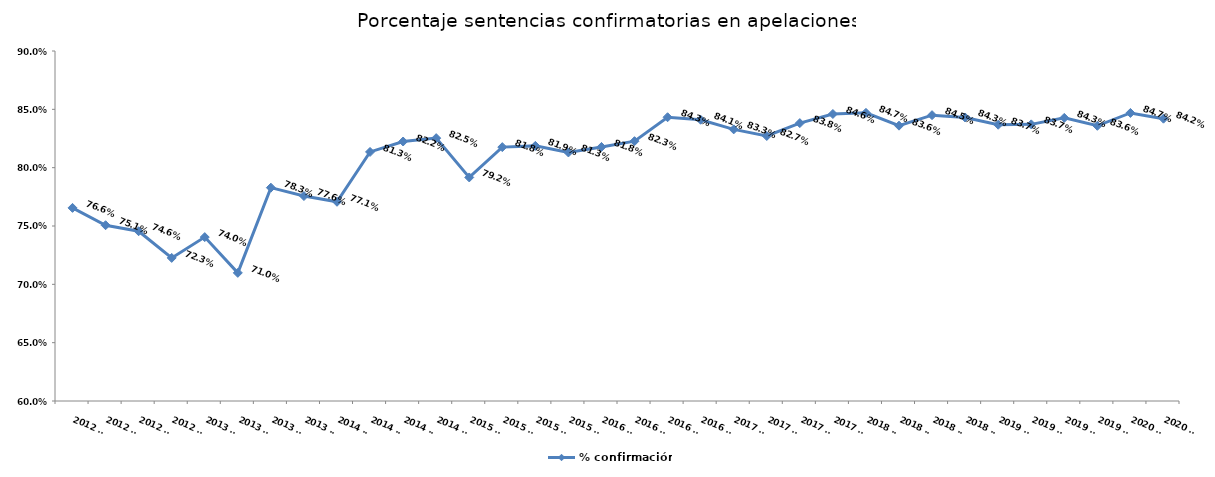
| Category | % confirmación |
|---|---|
| 2012 T1 | 0.766 |
| 2012 T2 | 0.751 |
| 2012 T3 | 0.746 |
| 2012 T4 | 0.723 |
| 2013 T1 | 0.74 |
| 2013 T2 | 0.71 |
| 2013 T3 | 0.783 |
| 2013 T4 | 0.776 |
| 2014 T1 | 0.771 |
| 2014 T2 | 0.813 |
| 2014 T3 | 0.822 |
| 2014 T4 | 0.825 |
| 2015 T1 | 0.792 |
| 2015 T2 | 0.818 |
| 2015 T3 | 0.819 |
| 2015 T4 | 0.813 |
| 2016 T1 | 0.818 |
| 2016 T2 | 0.823 |
| 2016 T3 | 0.843 |
| 2016 T4 | 0.841 |
| 2017 T1 | 0.833 |
| 2017 T2 | 0.827 |
| 2017 T3 | 0.838 |
| 2017 T4 | 0.846 |
| 2018 T1 | 0.847 |
| 2018 T2 | 0.836 |
| 2018 T3 | 0.845 |
| 2018 T4 | 0.843 |
| 2019 T1 | 0.837 |
| 2019 T2 | 0.837 |
| 2019 T3 | 0.843 |
| 2019 T4 | 0.836 |
| 2020 T1 | 0.847 |
| 2020 T2 | 0.842 |